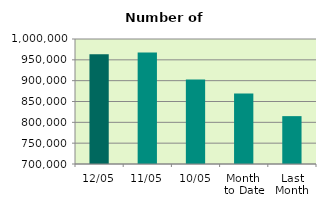
| Category | Series 0 |
|---|---|
| 12/05 | 963230 |
| 11/05 | 967592 |
| 10/05 | 903028 |
| Month 
to Date | 869140.889 |
| Last
Month | 814883.684 |